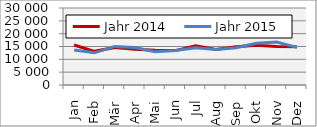
| Category | Jahr 2014 | Jahr 2015 |
|---|---|---|
| Jan | 15563.609 | 13628.078 |
| Feb | 13116.342 | 12530.381 |
| Mär | 14596.795 | 15035.377 |
| Apr | 13911.357 | 14613.903 |
| Mai | 13569.649 | 12925.007 |
| Jun | 13408.417 | 13418.945 |
| Jul | 15276.285 | 14462.482 |
| Aug | 13802.177 | 13808.061 |
| Sep | 14941.03 | 14494.973 |
| Okt | 15519.133 | 16256.987 |
| Nov | 14983.271 | 16729.847 |
| Dez | 14886.917 | 14652.82 |